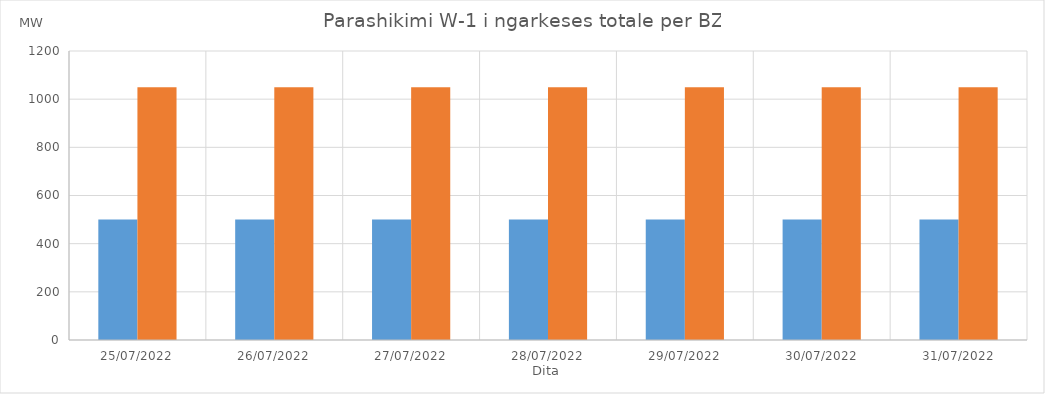
| Category | Min (MW) | Max (MW) |
|---|---|---|
| 25/07/2022 | 500 | 1050 |
| 26/07/2022 | 500 | 1050 |
| 27/07/2022 | 500 | 1050 |
| 28/07/2022 | 500 | 1050 |
| 29/07/2022 | 500 | 1050 |
| 30/07/2022 | 500 | 1050 |
| 31/07/2022 | 500 | 1050 |